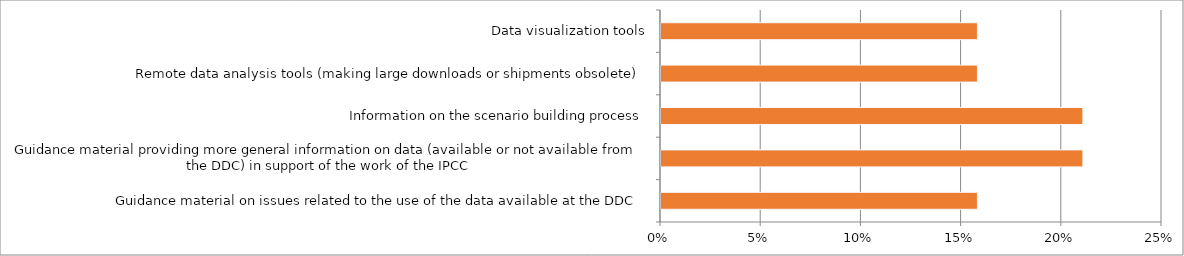
| Category | Series 0 |
|---|---|
| Guidance material on issues related to the use of the data available at the DDC | 0.158 |
| Guidance material providing more general information on data (available or not available from the DDC) in support of the work of the IPCC | 0.211 |
| Information on the scenario building process | 0.211 |
| Remote data analysis tools (making large downloads or shipments obsolete) | 0.158 |
| Data visualization tools | 0.158 |